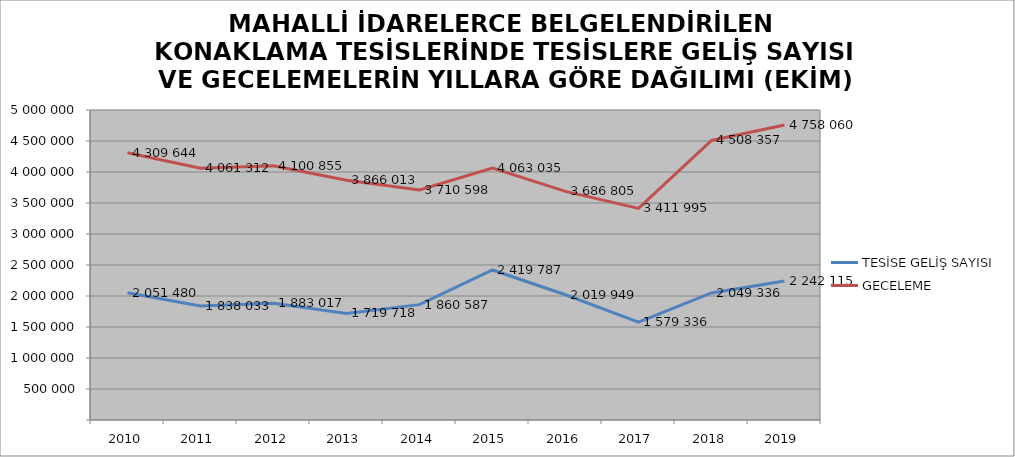
| Category | TESİSE GELİŞ SAYISI | GECELEME |
|---|---|---|
| 2010 | 2051480 | 4309644 |
| 2011 | 1838033 | 4061312 |
| 2012 | 1883017 | 4100855 |
| 2013 | 1719718 | 3866013 |
| 2014 | 1860587 | 3710598 |
| 2015 | 2419787 | 4063035 |
| 2016 | 2019949 | 3686805 |
| 2017 | 1579336 | 3411995 |
| 2018 | 2049336 | 4508357 |
| 2019 | 2242115 | 4758060 |